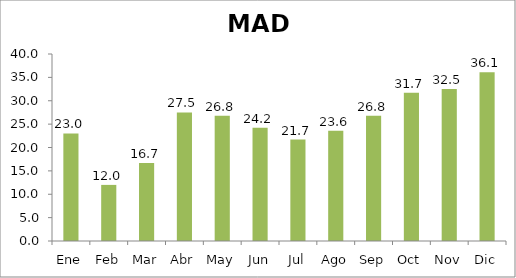
| Category | MAD |
|---|---|
| Ene | 23 |
| Feb | 12 |
| Mar | 16.7 |
| Abr | 27.5 |
| May | 26.8 |
| Jun | 24.2 |
| Jul | 21.7 |
| Ago | 23.6 |
| Sep | 26.8 |
| Oct | 31.7 |
| Nov | 32.5 |
| Dic | 36.1 |